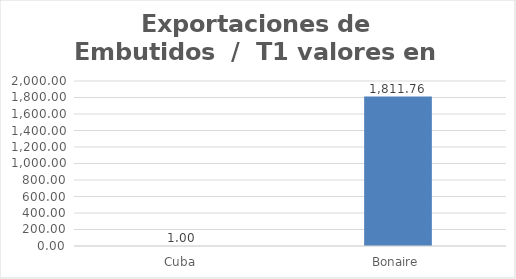
| Category | Valor US  |
|---|---|
| Cuba | 1 |
| Bonaire | 1811.76 |